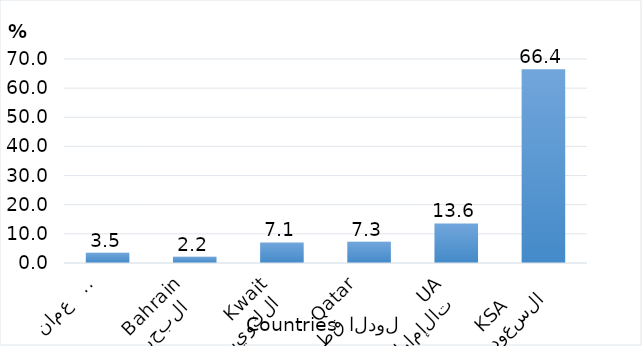
| Category | Series 0 |
|---|---|
| السعودية
 KSA      | 66.444 |
| الإمارات 
      UAE | 13.584 |
| قطر      
    Qatar | 7.28 |
| الكويت 
    Kwait | 7.057 |
| البحرين  
  Bahrain | 2.156 |
| عمان   
  Oman | 3.477 |